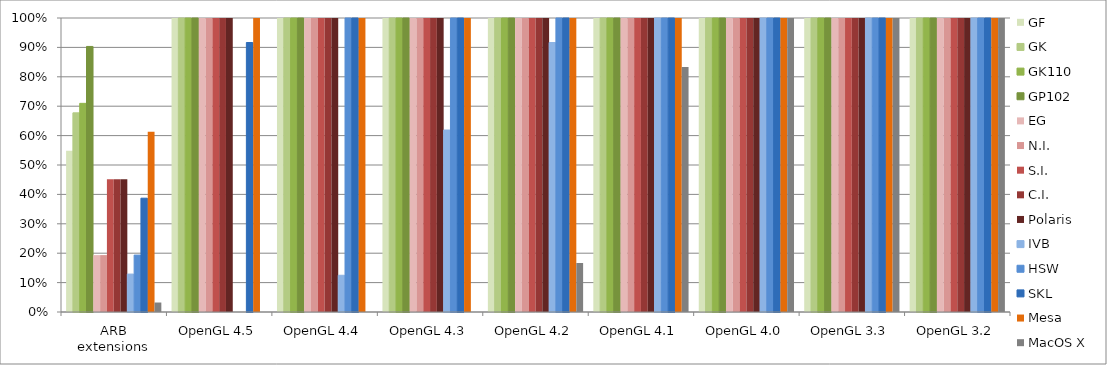
| Category | GF | GK | GK110 | GP102 | EG | N.I. | S.I. | C.I. | Polaris | IVB | HSW | SKL | Mesa | MacOS X |
|---|---|---|---|---|---|---|---|---|---|---|---|---|---|---|
| ARB extensions | 0.548 | 0.677 | 0.71 | 0.903 | 0.194 | 0.194 | 0.452 | 0.452 | 0.452 | 0.129 | 0.194 | 0.387 | 0.613 | 0.032 |
| OpenGL 4.5 | 1 | 1 | 1 | 1 | 1 | 1 | 1 | 1 | 1 | 0 | 0 | 0.917 | 1 | 0 |
| OpenGL 4.4 | 1 | 1 | 1 | 1 | 1 | 1 | 1 | 1 | 1 | 0.125 | 1 | 1 | 1 | 0 |
| OpenGL 4.3 | 1 | 1 | 1 | 1 | 1 | 1 | 1 | 1 | 1 | 0.619 | 1 | 1 | 1 | 0 |
| OpenGL 4.2 | 1 | 1 | 1 | 1 | 1 | 1 | 1 | 1 | 1 | 0.917 | 1 | 1 | 1 | 0.167 |
| OpenGL 4.1 | 1 | 1 | 1 | 1 | 1 | 1 | 1 | 1 | 1 | 1 | 1 | 1 | 1 | 0.833 |
| OpenGL 4.0 | 1 | 1 | 1 | 1 | 1 | 1 | 1 | 1 | 1 | 1 | 1 | 1 | 1 | 1 |
| OpenGL 3.3 | 1 | 1 | 1 | 1 | 1 | 1 | 1 | 1 | 1 | 1 | 1 | 1 | 1 | 1 |
| OpenGL 3.2 | 1 | 1 | 1 | 1 | 1 | 1 | 1 | 1 | 1 | 1 | 1 | 1 | 1 | 1 |